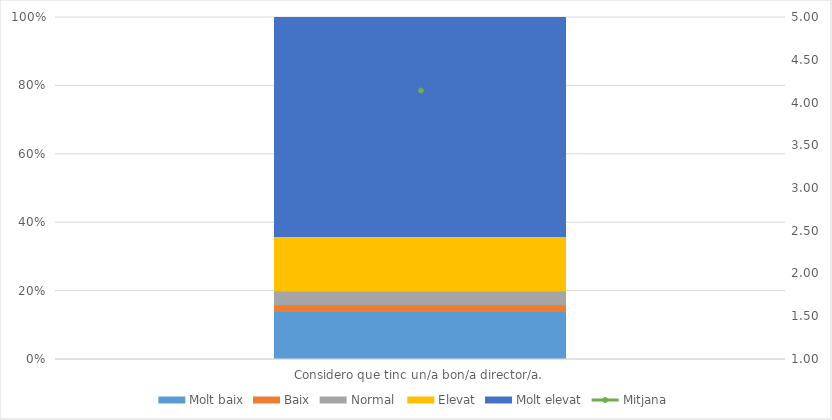
| Category | Molt baix | Baix | Normal  | Elevat | Molt elevat |
|---|---|---|---|---|---|
| Considero que tinc un/a bon/a director/a. | 7 | 1 | 2 | 8 | 32 |